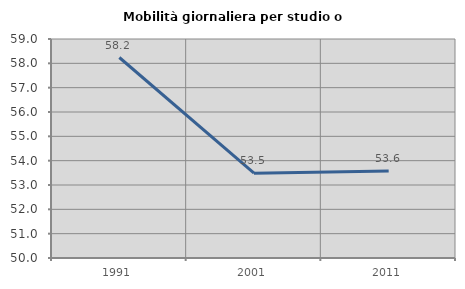
| Category | Mobilità giornaliera per studio o lavoro |
|---|---|
| 1991.0 | 58.24 |
| 2001.0 | 53.484 |
| 2011.0 | 53.574 |